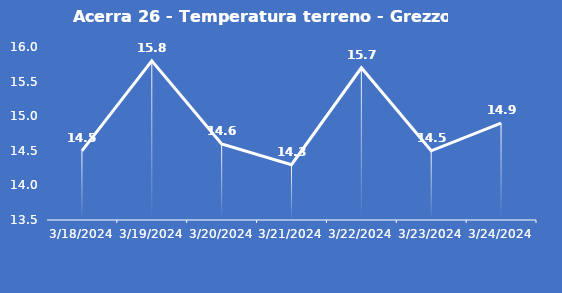
| Category | Acerra 26 - Temperatura terreno - Grezzo (°C) |
|---|---|
| 3/18/24 | 14.5 |
| 3/19/24 | 15.8 |
| 3/20/24 | 14.6 |
| 3/21/24 | 14.3 |
| 3/22/24 | 15.7 |
| 3/23/24 | 14.5 |
| 3/24/24 | 14.9 |